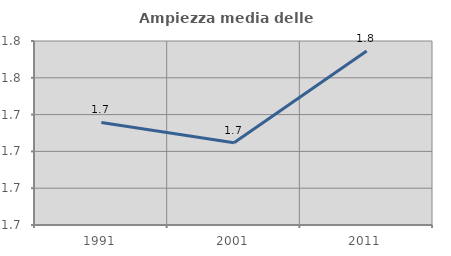
| Category | Ampiezza media delle famiglie |
|---|---|
| 1991.0 | 1.736 |
| 2001.0 | 1.725 |
| 2011.0 | 1.775 |